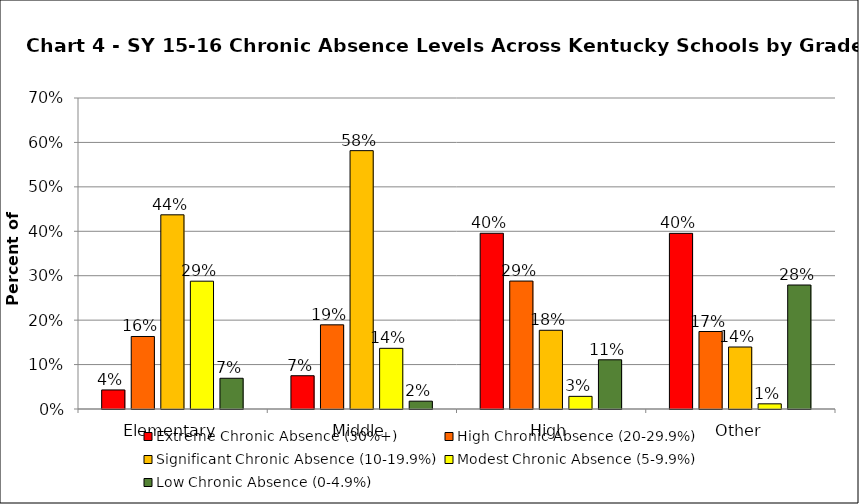
| Category | Extreme Chronic Absence (30%+) | High Chronic Absence (20-29.9%) | Significant Chronic Absence (10-19.9%) | Modest Chronic Absence (5-9.9%) | Low Chronic Absence (0-4.9%) |
|---|---|---|---|---|---|
| 0 | 0.043 | 0.163 | 0.437 | 0.288 | 0.069 |
| 1 | 0.075 | 0.189 | 0.581 | 0.137 | 0.018 |
| 2 | 0.396 | 0.288 | 0.177 | 0.028 | 0.111 |
| 3 | 0.395 | 0.174 | 0.14 | 0.012 | 0.279 |